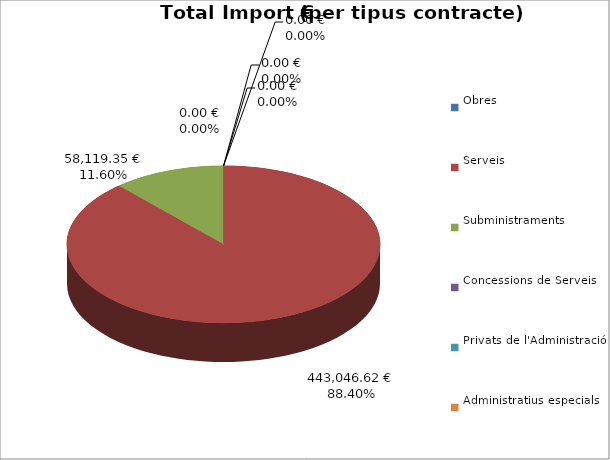
| Category | Total preu
(amb IVA) |
|---|---|
| Obres | 0 |
| Serveis | 443046.618 |
| Subministraments | 58119.349 |
| Concessions de Serveis | 0 |
| Privats de l'Administració | 0 |
| Administratius especials | 0 |